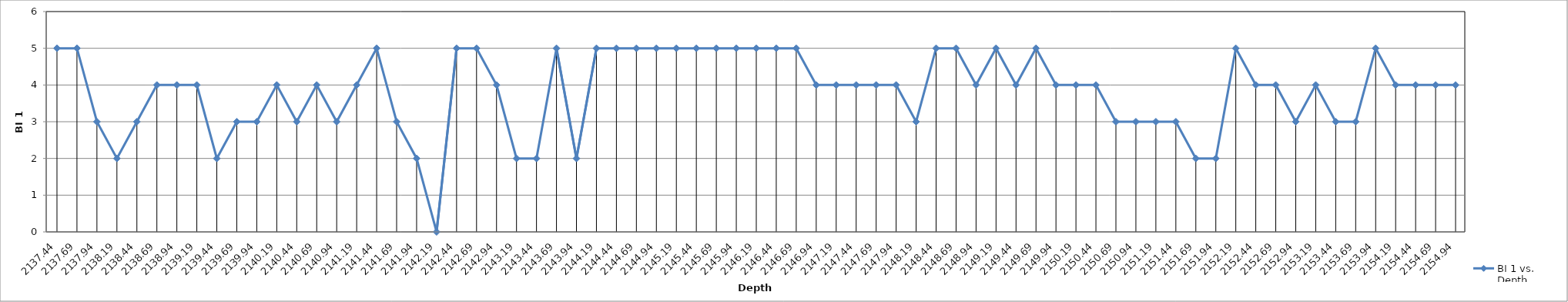
| Category | BI 1 vs. Depth |
|---|---|
| 2137.44 | 5 |
| 2137.69 | 5 |
| 2137.94 | 3 |
| 2138.19 | 2 |
| 2138.44 | 3 |
| 2138.69 | 4 |
| 2138.94 | 4 |
| 2139.19 | 4 |
| 2139.44 | 2 |
| 2139.69 | 3 |
| 2139.94 | 3 |
| 2140.19 | 4 |
| 2140.44 | 3 |
| 2140.69 | 4 |
| 2140.94 | 3 |
| 2141.19 | 4 |
| 2141.44 | 5 |
| 2141.69 | 3 |
| 2141.94 | 2 |
| 2142.19 | 0 |
| 2142.44 | 5 |
| 2142.69 | 5 |
| 2142.94 | 4 |
| 2143.19 | 2 |
| 2143.44 | 2 |
| 2143.69 | 5 |
| 2143.94 | 2 |
| 2144.19 | 5 |
| 2144.44 | 5 |
| 2144.69 | 5 |
| 2144.94 | 5 |
| 2145.19 | 5 |
| 2145.44 | 5 |
| 2145.69 | 5 |
| 2145.94 | 5 |
| 2146.19 | 5 |
| 2146.44 | 5 |
| 2146.69 | 5 |
| 2146.94 | 4 |
| 2147.19 | 4 |
| 2147.44 | 4 |
| 2147.69 | 4 |
| 2147.94 | 4 |
| 2148.19 | 3 |
| 2148.44 | 5 |
| 2148.69 | 5 |
| 2148.94 | 4 |
| 2149.19 | 5 |
| 2149.44 | 4 |
| 2149.69 | 5 |
| 2149.94 | 4 |
| 2150.19 | 4 |
| 2150.44 | 4 |
| 2150.69 | 3 |
| 2150.94 | 3 |
| 2151.19 | 3 |
| 2151.44 | 3 |
| 2151.69 | 2 |
| 2151.94 | 2 |
| 2152.19 | 5 |
| 2152.44 | 4 |
| 2152.69 | 4 |
| 2152.94 | 3 |
| 2153.19 | 4 |
| 2153.44 | 3 |
| 2153.69 | 3 |
| 2153.94 | 5 |
| 2154.19 | 4 |
| 2154.44 | 4 |
| 2154.69 | 4 |
| 2154.94 | 4 |